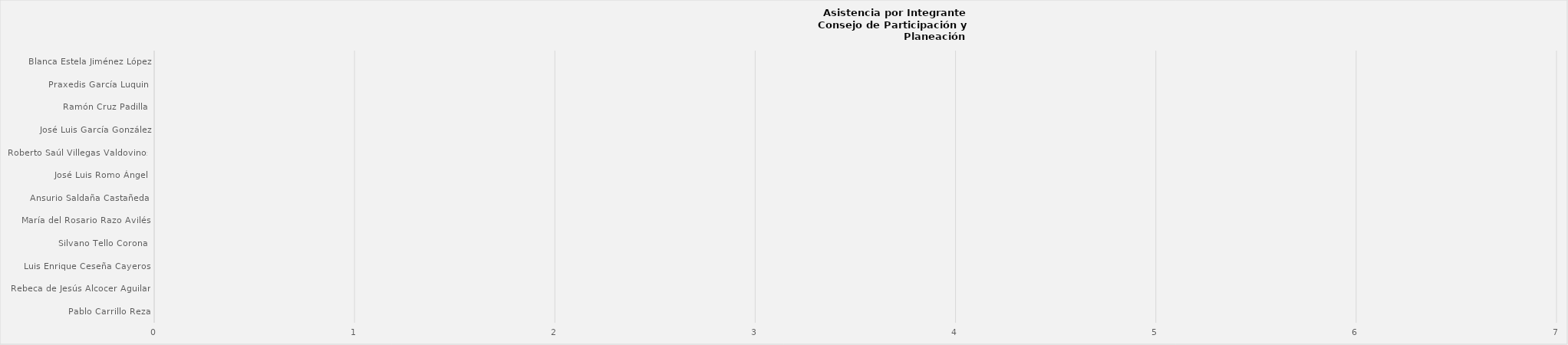
| Category | Series 0 |
|---|---|
| Pablo Carrillo Reza | 0 |
| Rebeca de Jesús Alcocer Aguilar  | 0 |
| Luis Enrique Ceseña Cayeros  | 0 |
| Silvano Tello Corona  | 0 |
| María del Rosario Razo Avilés  | 0 |
| Ansurio Saldaña Castañeda  | 0 |
| José Luis Romo Ángel  | 0 |
| Roberto Saúl Villegas Valdovinos  | 0 |
| José Luis García González | 0 |
| Ramón Cruz Padilla  | 0 |
| Praxedis García Luquin  | 0 |
| Blanca Estela Jiménez López | 0 |